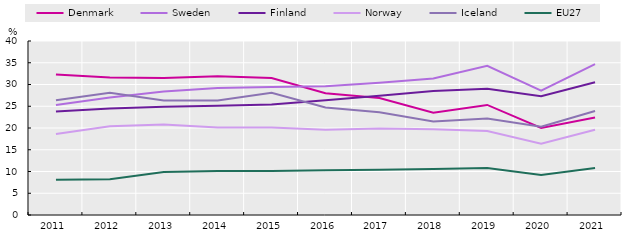
| Category | Denmark | Sweden | Finland | Norway | Iceland | EU27 |
|---|---|---|---|---|---|---|
| 2011.0 | 32.3 | 25.3 | 23.8 | 18.6 | 26.4 | 8.1 |
| 2012.0 | 31.6 | 27 | 24.5 | 20.4 | 28.1 | 8.2 |
| 2013.0 | 31.5 | 28.4 | 24.9 | 20.8 | 26.3 | 9.9 |
| 2014.0 | 31.9 | 29.2 | 25.1 | 20.1 | 26.3 | 10.1 |
| 2015.0 | 31.5 | 29.4 | 25.4 | 20.1 | 28.1 | 10.1 |
| 2016.0 | 28 | 29.6 | 26.4 | 19.6 | 24.7 | 10.3 |
| 2017.0 | 26.9 | 30.4 | 27.4 | 19.9 | 23.6 | 10.4 |
| 2018.0 | 23.5 | 31.4 | 28.5 | 19.7 | 21.5 | 10.6 |
| 2019.0 | 25.3 | 34.3 | 29 | 19.3 | 22.2 | 10.8 |
| 2020.0 | 20 | 28.6 | 27.3 | 16.4 | 20.3 | 9.2 |
| 2021.0 | 22.4 | 34.7 | 30.5 | 19.6 | 23.9 | 10.8 |